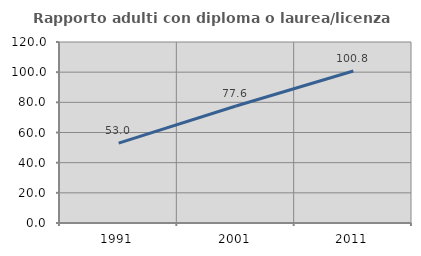
| Category | Rapporto adulti con diploma o laurea/licenza media  |
|---|---|
| 1991.0 | 52.952 |
| 2001.0 | 77.551 |
| 2011.0 | 100.751 |